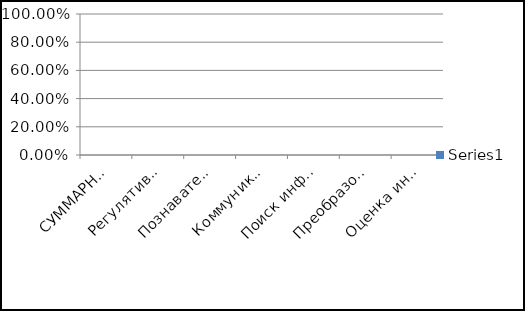
| Category | Series 0 |
|---|---|
| СУММАРНЫЕ БАЛЛЫ | 0 |
| Регулятивные УУД | 0 |
| Познавательные УУД | 0 |
| Коммуникативные УУД | 0 |
| Поиск информации и понимание прочитанного | 0 |
| Преобразование и интерпретация информации | 0 |
| Оценка информации | 0 |